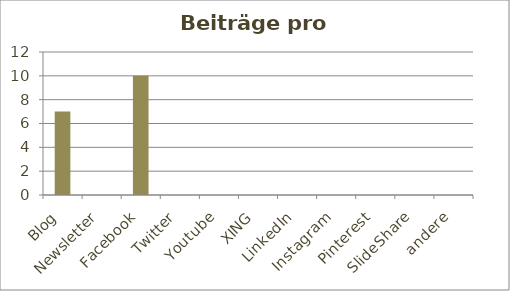
| Category | Beiträge |
|---|---|
| Blog | 7 |
| Newsletter | 0 |
| Facebook | 10 |
| Twitter | 0 |
| Youtube | 0 |
| XING | 0 |
| LinkedIn | 0 |
| Instagram | 0 |
| Pinterest | 0 |
| SlideShare | 0 |
| andere | 0 |